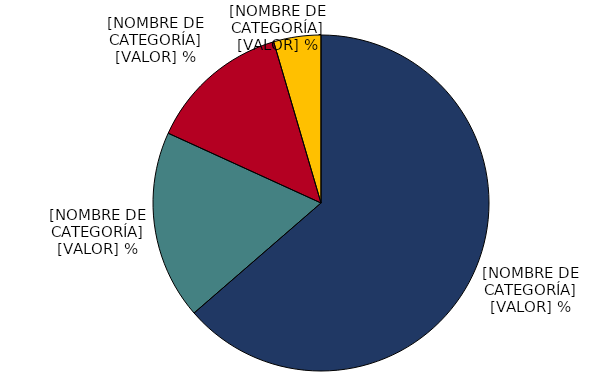
| Category | Series 0 |
|---|---|
| Ignorada | 63.636 |
| Fuera de la fuerza de trabajo o desempleada | 18.182 |
| En fuerza de trabajo | 13.636 |
| Menor | 4.545 |